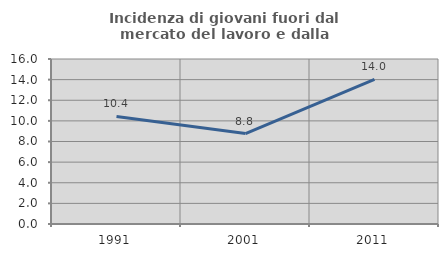
| Category | Incidenza di giovani fuori dal mercato del lavoro e dalla formazione  |
|---|---|
| 1991.0 | 10.435 |
| 2001.0 | 8.772 |
| 2011.0 | 14.035 |